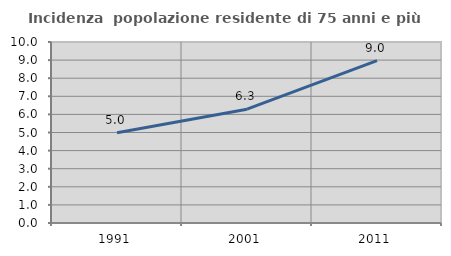
| Category | Incidenza  popolazione residente di 75 anni e più |
|---|---|
| 1991.0 | 4.985 |
| 2001.0 | 6.288 |
| 2011.0 | 8.968 |